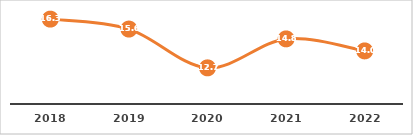
| Category | ABANDONO ESCOLAR (%) |
|---|---|
| 2018.0 | 16.32 |
| 2019.0 | 15.58 |
| 2020.0 | 12.691 |
| 2021.0 | 14.848 |
| 2022.0 | 13.953 |